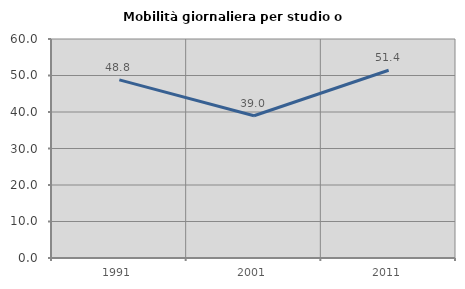
| Category | Mobilità giornaliera per studio o lavoro |
|---|---|
| 1991.0 | 48.81 |
| 2001.0 | 38.966 |
| 2011.0 | 51.441 |